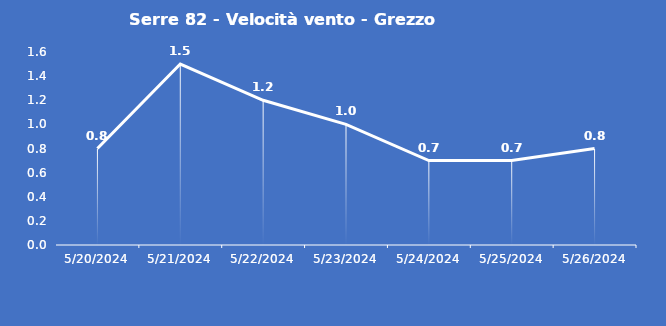
| Category | Serre 82 - Velocità vento - Grezzo (m/s) |
|---|---|
| 5/20/24 | 0.8 |
| 5/21/24 | 1.5 |
| 5/22/24 | 1.2 |
| 5/23/24 | 1 |
| 5/24/24 | 0.7 |
| 5/25/24 | 0.7 |
| 5/26/24 | 0.8 |